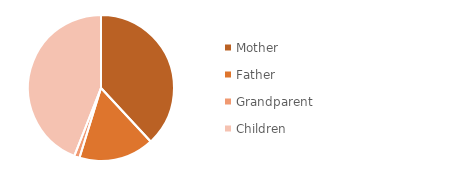
| Category | Series 0 |
|---|---|
| Mother | 32 |
| Father | 14 |
| Grandparent | 1 |
| Children | 37 |